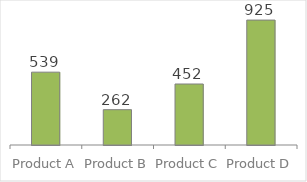
| Category | Series 0 |
|---|---|
| Product A | 539.477 |
| Product B | 261.631 |
| Product C | 451.791 |
| Product D | 925.272 |